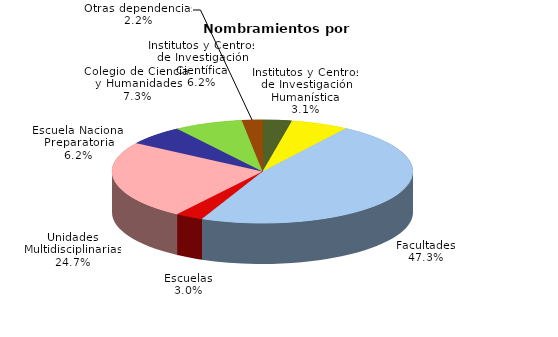
| Category | Series 0 |
|---|---|
| Institutos y Centros de Investigación Humanística | 1586 |
| Institutos y Centros de Investigación Científica | 3145 |
| Facultades | 24009 |
| Escuelas | 1519 |
| Unidades Multidisciplinarias | 12536 |
| Escuela Nacional Preparatoria | 3151 |
| Colegio de Ciencias y Humanidades | 3733 |
| Otras dependencias | 1115 |